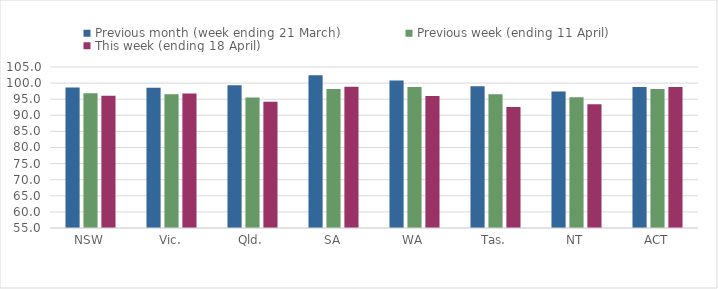
| Category | Previous month (week ending 21 March) | Previous week (ending 11 April) | This week (ending 18 April) |
|---|---|---|---|
| NSW | 98.603 | 96.856 | 96.072 |
| Vic. | 98.559 | 96.559 | 96.774 |
| Qld. | 99.351 | 95.543 | 94.171 |
| SA | 102.422 | 98.15 | 98.852 |
| WA | 100.812 | 98.825 | 95.994 |
| Tas. | 99.027 | 96.568 | 92.571 |
| NT | 97.374 | 95.623 | 93.461 |
| ACT | 98.783 | 98.175 | 98.788 |